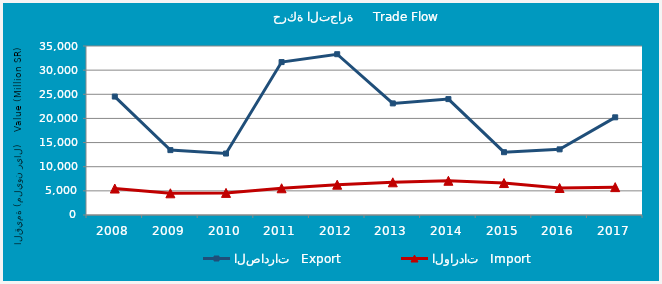
| Category | الصادرات   Export | الواردات   Import |
|---|---|---|
| 2008.0 | 24528714677 | 5478731388 |
| 2009.0 | 13436463955 | 4493896045 |
| 2010.0 | 12730068223 | 4581695813 |
| 2011.0 | 31667009039 | 5534252755 |
| 2012.0 | 33297933178 | 6273872253 |
| 2013.0 | 23113451306 | 6771460126 |
| 2014.0 | 24000195386 | 7088806851 |
| 2015.0 | 13006960922 | 6616347151 |
| 2016.0 | 13594865272 | 5593917295 |
| 2017.0 | 20228145032 | 5771072815 |